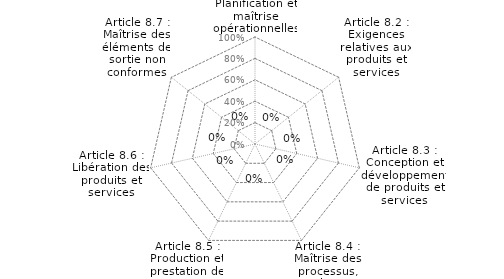
| Category | Article 8 : Réalisation des activités opérationnelles |
|---|---|
| Article 8.1 : Planification et maîtrise opérationnelles | 0 |
| Article 8.2 : Exigences relatives aux produits et services | 0 |
| Article 8.3 : Conception et développement de produits et services | 0 |
| Article 8.4 : Maîtrise des processus, produits et services fournis par des prestataires externes | 0 |
| Article 8.5 : Production et prestation de service | 0 |
| Article 8.6 : Libération des produits et services | 0 |
| Article 8.7 : Maîtrise des éléments de sortie non conformes | 0 |